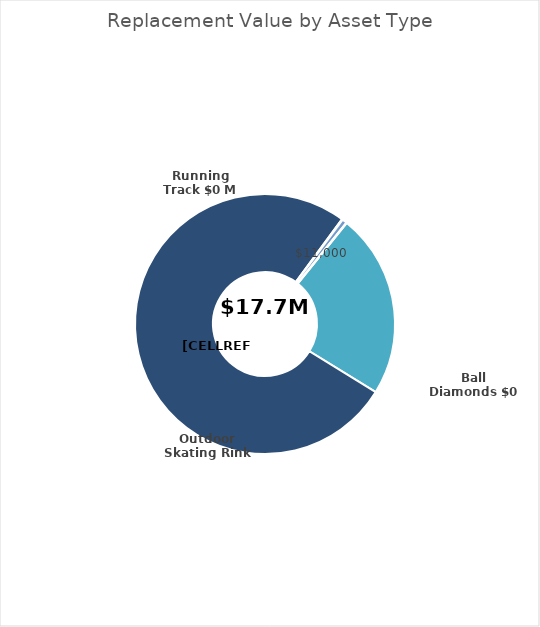
| Category | Series 1 |
|---|---|
| Playgrounds | 0 |
| Parks | 0 |
| Recreation Centre and Pool | 4058000 |
| Arena  | 13500000 |
| Ball Diamonds | 18000 |
| Outdoor Skating Rink | 0 |
| Boat Launch | 103000 |
| Race Track | 0 |
| Running Track | 0 |
| Cemetary | 0 |
| Holiday Decorations | 0 |
| Trails | 0 |
| Benches | 11000 |
| Garbage Cans | 0 |
| Other | 0 |